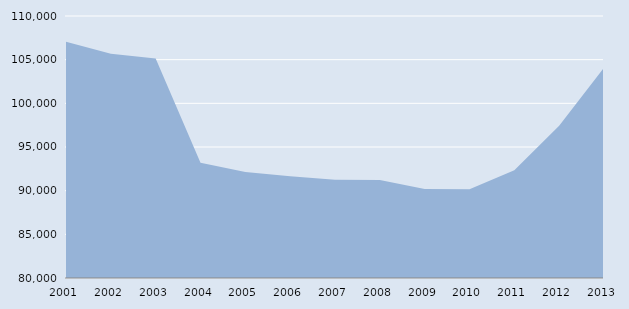
| Category | Series 0 |
|---|---|
| 2001.0 | 107057 |
| 2002.0 | 105667 |
| 2003.0 | 105135 |
| 2004.0 | 93190 |
| 2005.0 | 92136 |
| 2006.0 | 91651 |
| 2007.0 | 91253 |
| 2008.0 | 91225 |
| 2009.0 | 90203 |
| 2010.0 | 90148 |
| 2011.0 | 92343 |
| 2012.0 | 97445 |
| 2013.0 | 104084 |